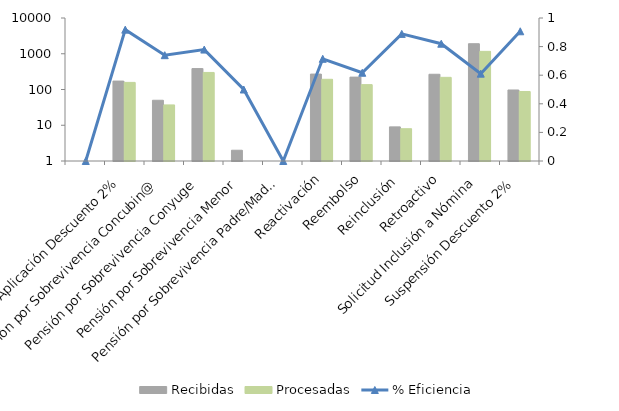
| Category | Recibidas | Procesadas |
|---|---|---|
|  | 0 | 0 |
| Aplicación Descuento 2% | 172 | 158 |
| Pensión por Sobrevivencia Concubin@ | 50 | 37 |
| Pensión por Sobrevivencia Conyuge | 385 | 300 |
| Pensión por Sobrevivencia Menor | 2 | 1 |
| Pensión por Sobrevivencia Padre/Madre | 0 | 0 |
| Reactivación | 270 | 193 |
| Reembolso | 222 | 137 |
| Reinclusión | 9 | 8 |
| Retroactivo | 267 | 219 |
| Solicitud Inclusión a Nómina | 1909 | 1166 |
| Suspensión Descuento 2% | 97 | 88 |